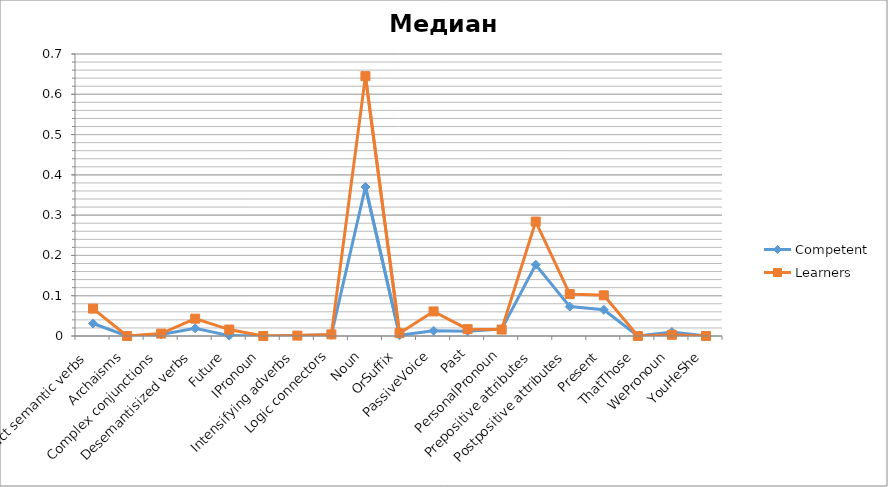
| Category | Competent | Learners |
|---|---|---|
| Abstract semantic verbs | 0.031 | 0.068 |
| Archaisms | 0 | 0 |
| Complex conjunctions | 0.004 | 0.006 |
| Desemantisized verbs | 0.019 | 0.043 |
| Future | 0.001 | 0.016 |
| IPronoun | 0 | 0 |
| Intensifying adverbs | 0.001 | 0.001 |
| Logic connectors | 0.003 | 0.004 |
| Noun | 0.37 | 0.645 |
| OrSuffix | 0.002 | 0.007 |
| PassiveVoice | 0.013 | 0.061 |
| Past | 0.012 | 0.017 |
| PersonalPronoun | 0.017 | 0.016 |
| Prepositive attributes | 0.177 | 0.284 |
| Postpositive attributes | 0.073 | 0.104 |
| Present | 0.065 | 0.101 |
| ThatThose | 0 | 0 |
| WePronoun | 0.01 | 0.003 |
| YouHeShe | 0 | 0 |